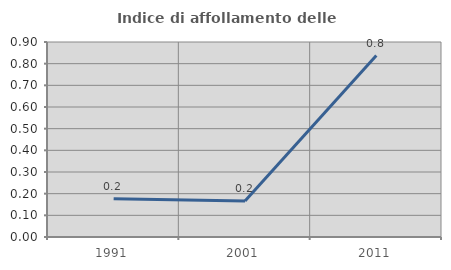
| Category | Indice di affollamento delle abitazioni  |
|---|---|
| 1991.0 | 0.177 |
| 2001.0 | 0.166 |
| 2011.0 | 0.838 |